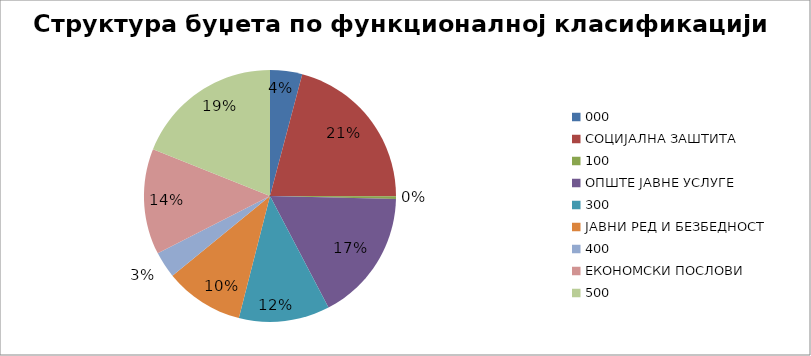
| Category | Series 0 |
|---|---|
| 0 | 37960000 |
| 1 | 192579000 |
| 2 | 3100000 |
| 3 | 156100000 |
| 4 | 107400000 |
| 5 | 93240000 |
| 6 | 31100000 |
| 7 | 125001000 |
| 8 | 174520000 |